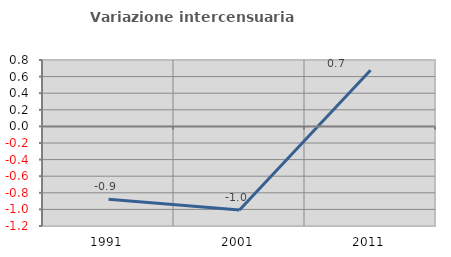
| Category | Variazione intercensuaria annua |
|---|---|
| 1991.0 | -0.879 |
| 2001.0 | -1.008 |
| 2011.0 | 0.676 |